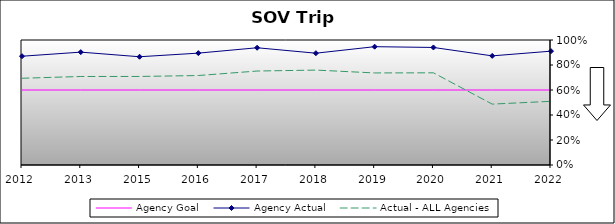
| Category | Agency Goal | Agency Actual | Actual - ALL Agencies |
|---|---|---|---|
| 2012.0 | 0.6 | 0.87 | 0.694 |
| 2013.0 | 0.6 | 0.903 | 0.708 |
| 2015.0 | 0.6 | 0.866 | 0.708 |
| 2016.0 | 0.6 | 0.895 | 0.716 |
| 2017.0 | 0.6 | 0.938 | 0.752 |
| 2018.0 | 0.6 | 0.894 | 0.759 |
| 2019.0 | 0.6 | 0.947 | 0.736 |
| 2020.0 | 0.6 | 0.94 | 0.737 |
| 2021.0 | 0.6 | 0.873 | 0.487 |
| 2022.0 | 0.6 | 0.911 | 0.509 |